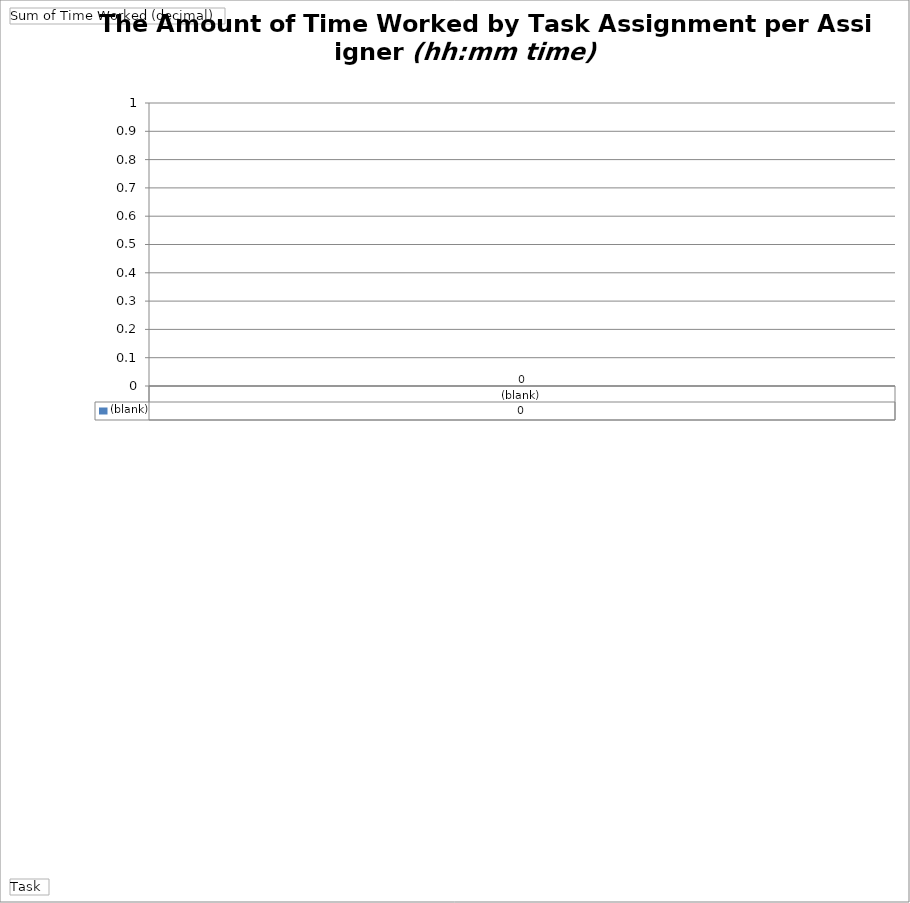
| Category | (blank) |
|---|---|
| (blank) | 0 |